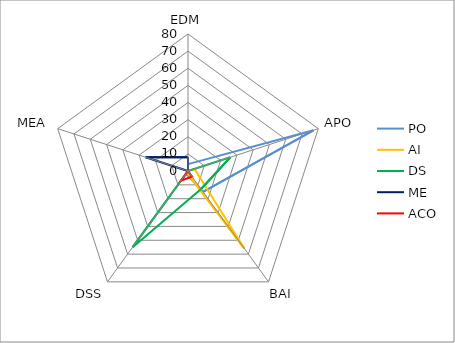
| Category | PO | AI | DS | ME | ACO |
|---|---|---|---|---|---|
| 0 | 4 | 0 | 0 | 8 | 0 |
| 1 | 77 | 4 | 26 | 0 | 0 |
| 2 | 15 | 56 | 13 | 0 | 4 |
| 3 | 2 | 1 | 55 | 0 | 7 |
| 4 | 0 | 0 | 0 | 26 | 0 |